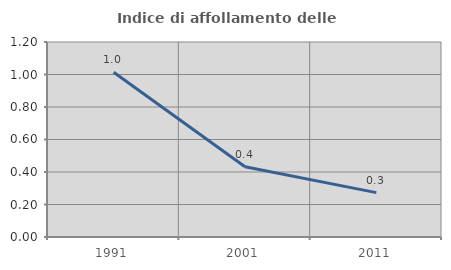
| Category | Indice di affollamento delle abitazioni  |
|---|---|
| 1991.0 | 1.014 |
| 2001.0 | 0.432 |
| 2011.0 | 0.273 |